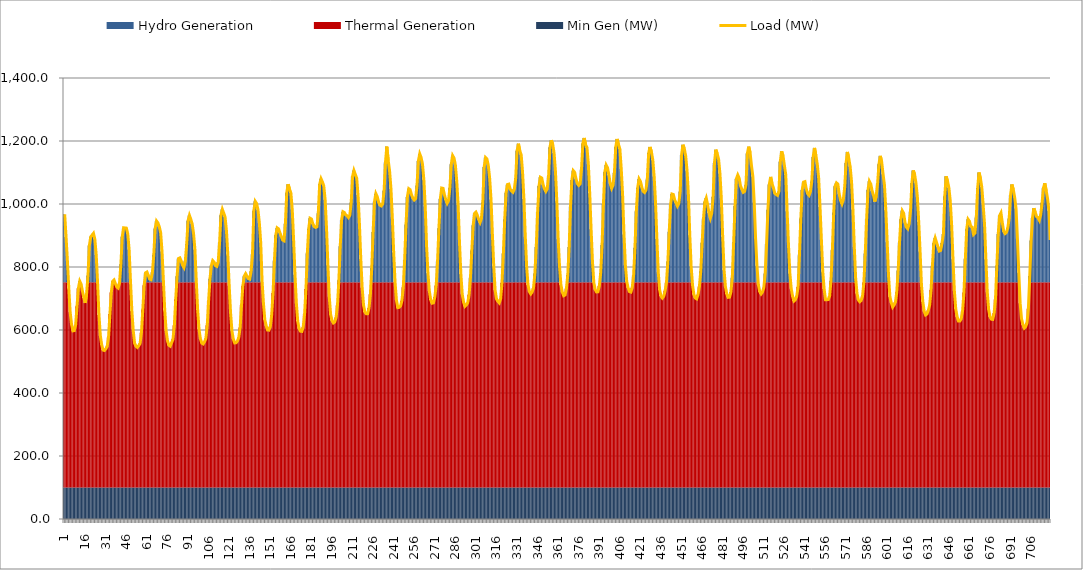
| Category | Min Gen (MW) | Thermal Generation | Hydro Generation |
|---|---|---|---|
| 1.0 | 100 | 651.288 | 216.149 |
| 2.0 | 100 | 651.288 | 143.571 |
| 3.0 | 100 | 651.288 | 66.719 |
| 4.0 | 100 | 632.033 | 0 |
| 5.0 | 100 | 556.286 | 0 |
| 6.0 | 100 | 518.188 | 0 |
| 7.0 | 100 | 497.248 | 0 |
| 8.0 | 100 | 498.122 | 0 |
| 9.0 | 100 | 516.383 | 0 |
| 10.0 | 100 | 575.154 | 0 |
| 11.0 | 100 | 632.534 | 0 |
| 12.0 | 100 | 651.288 | 3.547 |
| 13.0 | 100 | 645.373 | 0 |
| 14.0 | 100 | 621.87 | 0 |
| 15.0 | 100 | 601.825 | 0 |
| 16.0 | 100 | 585.856 | 0 |
| 17.0 | 100 | 615.7 | 0 |
| 18.0 | 100 | 651.288 | 21.34 |
| 19.0 | 100 | 651.288 | 116.661 |
| 20.0 | 100 | 651.288 | 144.428 |
| 21.0 | 100 | 651.288 | 149.88 |
| 22.0 | 100 | 651.288 | 155.557 |
| 23.0 | 100 | 651.288 | 136.68 |
| 24.0 | 100 | 651.288 | 86.635 |
| 25.0 | 100 | 649.834 | 0 |
| 26.0 | 100 | 547.674 | 0 |
| 27.0 | 100 | 482.234 | 0 |
| 28.0 | 100 | 452.803 | 0 |
| 29.0 | 100 | 436.325 | 0 |
| 30.0 | 100 | 435.028 | 0 |
| 31.0 | 100 | 439.875 | 0 |
| 32.0 | 100 | 447.696 | 0 |
| 33.0 | 100 | 477.305 | 0 |
| 34.0 | 100 | 550.943 | 0 |
| 35.0 | 100 | 618.675 | 0 |
| 36.0 | 100 | 651.288 | 3.34 |
| 37.0 | 100 | 651.288 | 7.448 |
| 38.0 | 100 | 646.757 | 0 |
| 39.0 | 100 | 636.496 | 0 |
| 40.0 | 100 | 633.091 | 0 |
| 41.0 | 100 | 648.858 | 0 |
| 42.0 | 100 | 651.288 | 57.212 |
| 43.0 | 100 | 651.288 | 145.111 |
| 44.0 | 100 | 651.288 | 173.255 |
| 45.0 | 100 | 651.288 | 172.578 |
| 46.0 | 100 | 651.288 | 172.202 |
| 47.0 | 100 | 651.288 | 153.997 |
| 48.0 | 100 | 651.288 | 104.059 |
| 49.0 | 100 | 651.288 | 4.13 |
| 50.0 | 100 | 560.334 | 0 |
| 51.0 | 100 | 498.241 | 0 |
| 52.0 | 100 | 457.922 | 0 |
| 53.0 | 100 | 448.782 | 0 |
| 54.0 | 100 | 444.621 | 0 |
| 55.0 | 100 | 450.14 | 0 |
| 56.0 | 100 | 457.413 | 0 |
| 57.0 | 100 | 491.998 | 0 |
| 58.0 | 100 | 565.444 | 0 |
| 59.0 | 100 | 642.311 | 0 |
| 60.0 | 100 | 651.288 | 30.083 |
| 61.0 | 100 | 651.288 | 32.78 |
| 62.0 | 100 | 651.288 | 22.235 |
| 63.0 | 100 | 651.288 | 10.411 |
| 64.0 | 100 | 651.288 | 8.234 |
| 65.0 | 100 | 651.288 | 32.075 |
| 66.0 | 100 | 651.288 | 87.612 |
| 67.0 | 100 | 651.288 | 170.656 |
| 68.0 | 100 | 651.288 | 194.668 |
| 69.0 | 100 | 651.288 | 188.659 |
| 70.0 | 100 | 651.288 | 176.569 |
| 71.0 | 100 | 651.288 | 157.797 |
| 72.0 | 100 | 651.288 | 98.161 |
| 73.0 | 100 | 651.288 | 5.673 |
| 74.0 | 100 | 562.038 | 0 |
| 75.0 | 100 | 496.705 | 0 |
| 76.0 | 100 | 465.662 | 0 |
| 77.0 | 100 | 451.708 | 0 |
| 78.0 | 100 | 448.698 | 0 |
| 79.0 | 100 | 459.694 | 0 |
| 80.0 | 100 | 470.505 | 0 |
| 81.0 | 100 | 514.441 | 0 |
| 82.0 | 100 | 597.545 | 0 |
| 83.0 | 100 | 651.288 | 19.617 |
| 84.0 | 100 | 651.288 | 75.374 |
| 85.0 | 100 | 651.288 | 77.615 |
| 86.0 | 100 | 651.288 | 67.983 |
| 87.0 | 100 | 651.288 | 54.461 |
| 88.0 | 100 | 651.288 | 47.081 |
| 89.0 | 100 | 651.288 | 67.995 |
| 90.0 | 100 | 651.288 | 120.781 |
| 91.0 | 100 | 651.288 | 195.656 |
| 92.0 | 100 | 651.288 | 212.52 |
| 93.0 | 100 | 651.288 | 200.225 |
| 94.0 | 100 | 651.288 | 185.296 |
| 95.0 | 100 | 651.288 | 154.869 |
| 96.0 | 100 | 651.288 | 104.261 |
| 97.0 | 100 | 651.288 | 3.17 |
| 98.0 | 100 | 563.456 | 0 |
| 99.0 | 100 | 502.173 | 0 |
| 100.0 | 100 | 471.88 | 0 |
| 101.0 | 100 | 458.504 | 0 |
| 102.0 | 100 | 455.849 | 0 |
| 103.0 | 100 | 462.394 | 0 |
| 104.0 | 100 | 473.02 | 0 |
| 105.0 | 100 | 514.906 | 0 |
| 106.0 | 100 | 593.203 | 0 |
| 107.0 | 100 | 651.288 | 11.653 |
| 108.0 | 100 | 651.288 | 53.264 |
| 109.0 | 100 | 651.288 | 68.945 |
| 110.0 | 100 | 651.288 | 64 |
| 111.0 | 100 | 651.288 | 52.959 |
| 112.0 | 100 | 651.288 | 50.694 |
| 113.0 | 100 | 651.288 | 64.802 |
| 114.0 | 100 | 651.288 | 126.207 |
| 115.0 | 100 | 651.288 | 213.09 |
| 116.0 | 100 | 651.288 | 231.721 |
| 117.0 | 100 | 651.288 | 219.838 |
| 118.0 | 100 | 651.288 | 207.291 |
| 119.0 | 100 | 651.288 | 164.085 |
| 120.0 | 100 | 651.288 | 88.027 |
| 121.0 | 100 | 640.786 | 0 |
| 122.0 | 100 | 554.681 | 0 |
| 123.0 | 100 | 497.255 | 0 |
| 124.0 | 100 | 471.229 | 0 |
| 125.0 | 100 | 458.87 | 0 |
| 126.0 | 100 | 459.447 | 0 |
| 127.0 | 100 | 464.704 | 0 |
| 128.0 | 100 | 476.3 | 0 |
| 129.0 | 100 | 508.152 | 0 |
| 130.0 | 100 | 579.16 | 0 |
| 131.0 | 100 | 640.398 | 0 |
| 132.0 | 100 | 651.288 | 19.594 |
| 133.0 | 100 | 651.288 | 27.554 |
| 134.0 | 100 | 651.288 | 19.63 |
| 135.0 | 100 | 651.288 | 11.944 |
| 136.0 | 100 | 651.288 | 10.361 |
| 137.0 | 100 | 651.288 | 35.449 |
| 138.0 | 100 | 651.288 | 90.032 |
| 139.0 | 100 | 651.288 | 227.379 |
| 140.0 | 100 | 651.288 | 257.149 |
| 141.0 | 100 | 651.288 | 250.357 |
| 142.0 | 100 | 651.288 | 230.194 |
| 143.0 | 100 | 651.288 | 188.408 |
| 144.0 | 100 | 651.288 | 126.349 |
| 145.0 | 100 | 651.288 | 2.885 |
| 146.0 | 100 | 584.209 | 0 |
| 147.0 | 100 | 532.189 | 0 |
| 148.0 | 100 | 513.198 | 0 |
| 149.0 | 100 | 499.936 | 0 |
| 150.0 | 100 | 499.598 | 0 |
| 151.0 | 100 | 510.473 | 0 |
| 152.0 | 100 | 547.758 | 0 |
| 153.0 | 100 | 617.421 | 0 |
| 154.0 | 100 | 651.288 | 69.211 |
| 155.0 | 100 | 651.288 | 149.945 |
| 156.0 | 100 | 651.288 | 172.909 |
| 157.0 | 100 | 651.288 | 169.819 |
| 158.0 | 100 | 651.288 | 157.233 |
| 159.0 | 100 | 651.288 | 145.859 |
| 160.0 | 100 | 651.288 | 134.413 |
| 161.0 | 100 | 651.288 | 131.932 |
| 162.0 | 100 | 651.288 | 186.28 |
| 163.0 | 100 | 651.288 | 284.761 |
| 164.0 | 100 | 651.288 | 311.615 |
| 165.0 | 100 | 651.288 | 296.129 |
| 166.0 | 100 | 651.288 | 283.694 |
| 167.0 | 100 | 651.288 | 230.874 |
| 168.0 | 100 | 651.288 | 133.759 |
| 169.0 | 100 | 651.288 | 24.033 |
| 170.0 | 100 | 584.532 | 0 |
| 171.0 | 100 | 527.97 | 0 |
| 172.0 | 100 | 504.423 | 0 |
| 173.0 | 100 | 496.158 | 0 |
| 174.0 | 100 | 495.66 | 0 |
| 175.0 | 100 | 509.12 | 0 |
| 176.0 | 100 | 550.42 | 0 |
| 177.0 | 100 | 629.994 | 0 |
| 178.0 | 100 | 651.288 | 91.805 |
| 179.0 | 100 | 651.288 | 169.991 |
| 180.0 | 100 | 651.288 | 203.492 |
| 181.0 | 100 | 651.288 | 201.152 |
| 182.0 | 100 | 651.288 | 186.006 |
| 183.0 | 100 | 651.288 | 177.146 |
| 184.0 | 100 | 651.288 | 174.331 |
| 185.0 | 100 | 651.288 | 176.251 |
| 186.0 | 100 | 651.288 | 219.377 |
| 187.0 | 100 | 651.288 | 311.381 |
| 188.0 | 100 | 651.288 | 328.763 |
| 189.0 | 100 | 651.288 | 318.867 |
| 190.0 | 100 | 651.288 | 305.968 |
| 191.0 | 100 | 651.288 | 261.841 |
| 192.0 | 100 | 651.288 | 170.971 |
| 193.0 | 100 | 651.288 | 54.389 |
| 194.0 | 100 | 605.369 | 0 |
| 195.0 | 100 | 549.406 | 0 |
| 196.0 | 100 | 529.984 | 0 |
| 197.0 | 100 | 522.382 | 0 |
| 198.0 | 100 | 525.548 | 0 |
| 199.0 | 100 | 539.78 | 0 |
| 200.0 | 100 | 578.813 | 0 |
| 201.0 | 100 | 651.288 | 6.333 |
| 202.0 | 100 | 651.288 | 114.855 |
| 203.0 | 100 | 651.288 | 197.415 |
| 204.0 | 100 | 651.288 | 224.194 |
| 205.0 | 100 | 651.288 | 221.924 |
| 206.0 | 100 | 651.288 | 213.967 |
| 207.0 | 100 | 651.288 | 211.472 |
| 208.0 | 100 | 651.288 | 205.738 |
| 209.0 | 100 | 651.288 | 212.998 |
| 210.0 | 100 | 651.288 | 253.247 |
| 211.0 | 100 | 651.288 | 336.246 |
| 212.0 | 100 | 651.288 | 355.038 |
| 213.0 | 100 | 651.288 | 342.685 |
| 214.0 | 100 | 651.288 | 330.845 |
| 215.0 | 100 | 651.288 | 277.054 |
| 216.0 | 100 | 651.288 | 185.917 |
| 217.0 | 100 | 651.288 | 73.949 |
| 218.0 | 100 | 633.886 | 0 |
| 219.0 | 100 | 579.365 | 0 |
| 220.0 | 100 | 556.797 | 0 |
| 221.0 | 100 | 551.558 | 0 |
| 222.0 | 100 | 551.861 | 0 |
| 223.0 | 100 | 569.768 | 0 |
| 224.0 | 100 | 613.15 | 0 |
| 225.0 | 100 | 651.288 | 45.579 |
| 226.0 | 100 | 651.288 | 159.708 |
| 227.0 | 100 | 651.288 | 256.019 |
| 228.0 | 100 | 651.288 | 281.534 |
| 229.0 | 100 | 651.288 | 272.109 |
| 230.0 | 100 | 651.288 | 254.31 |
| 231.0 | 100 | 651.288 | 244.783 |
| 232.0 | 100 | 651.288 | 242.547 |
| 233.0 | 100 | 651.288 | 248.96 |
| 234.0 | 100 | 651.288 | 291.141 |
| 235.0 | 100 | 651.288 | 380.68 |
| 236.0 | 100 | 651.288 | 430.872 |
| 237.0 | 100 | 651.288 | 387.023 |
| 238.0 | 100 | 651.288 | 353.816 |
| 239.0 | 100 | 651.288 | 297.286 |
| 240.0 | 100 | 651.288 | 207.002 |
| 241.0 | 100 | 651.288 | 94.801 |
| 242.0 | 100 | 651.288 | 0.113 |
| 243.0 | 100 | 594.392 | 0 |
| 244.0 | 100 | 571.218 | 0 |
| 245.0 | 100 | 572.102 | 0 |
| 246.0 | 100 | 576.132 | 0 |
| 247.0 | 100 | 592.738 | 0 |
| 248.0 | 100 | 635.601 | 0 |
| 249.0 | 100 | 651.288 | 71.487 |
| 250.0 | 100 | 651.288 | 183.523 |
| 251.0 | 100 | 651.288 | 271.316 |
| 252.0 | 100 | 651.288 | 297.341 |
| 253.0 | 100 | 651.288 | 294.192 |
| 254.0 | 100 | 651.288 | 277.759 |
| 255.0 | 100 | 651.288 | 267.015 |
| 256.0 | 100 | 651.288 | 261.146 |
| 257.0 | 100 | 651.288 | 265.434 |
| 258.0 | 100 | 651.288 | 307.293 |
| 259.0 | 100 | 651.288 | 385.082 |
| 260.0 | 100 | 651.288 | 407.818 |
| 261.0 | 100 | 651.288 | 396.374 |
| 262.0 | 100 | 651.288 | 375.215 |
| 263.0 | 100 | 651.288 | 325.969 |
| 264.0 | 100 | 651.288 | 241.074 |
| 265.0 | 100 | 651.288 | 114.445 |
| 266.0 | 100 | 651.288 | 28.695 |
| 267.0 | 100 | 623.89 | 0 |
| 268.0 | 100 | 595.625 | 0 |
| 269.0 | 100 | 585.069 | 0 |
| 270.0 | 100 | 586.292 | 0 |
| 271.0 | 100 | 604.552 | 0 |
| 272.0 | 100 | 641.616 | 0 |
| 273.0 | 100 | 651.288 | 66.179 |
| 274.0 | 100 | 651.288 | 171.976 |
| 275.0 | 100 | 651.288 | 264.744 |
| 276.0 | 100 | 651.288 | 299.393 |
| 277.0 | 100 | 651.288 | 298.418 |
| 278.0 | 100 | 651.288 | 278.225 |
| 279.0 | 100 | 651.288 | 262.326 |
| 280.0 | 100 | 651.288 | 250.974 |
| 281.0 | 100 | 651.288 | 259.56 |
| 282.0 | 100 | 651.288 | 299.976 |
| 283.0 | 100 | 651.288 | 374.656 |
| 284.0 | 100 | 651.288 | 402.329 |
| 285.0 | 100 | 651.288 | 394.643 |
| 286.0 | 100 | 651.288 | 372.406 |
| 287.0 | 100 | 651.288 | 321.008 |
| 288.0 | 100 | 651.288 | 245.783 |
| 289.0 | 100 | 651.288 | 126.297 |
| 290.0 | 100 | 651.288 | 26.183 |
| 291.0 | 100 | 613.378 | 0 |
| 292.0 | 100 | 588.454 | 0 |
| 293.0 | 100 | 575.028 | 0 |
| 294.0 | 100 | 579.238 | 0 |
| 295.0 | 100 | 586.308 | 0 |
| 296.0 | 100 | 611.508 | 0 |
| 297.0 | 100 | 651.288 | 14.861 |
| 298.0 | 100 | 651.288 | 101.349 |
| 299.0 | 100 | 651.288 | 181.554 |
| 300.0 | 100 | 651.288 | 218.575 |
| 301.0 | 100 | 651.288 | 222.786 |
| 302.0 | 100 | 651.288 | 213.261 |
| 303.0 | 100 | 651.288 | 199.576 |
| 304.0 | 100 | 651.288 | 189.881 |
| 305.0 | 100 | 651.288 | 202.237 |
| 306.0 | 100 | 651.288 | 253.627 |
| 307.0 | 100 | 651.288 | 365.987 |
| 308.0 | 100 | 651.288 | 396.269 |
| 309.0 | 100 | 651.288 | 391.814 |
| 310.0 | 100 | 651.288 | 371.484 |
| 311.0 | 100 | 651.288 | 330.88 |
| 312.0 | 100 | 651.288 | 263.172 |
| 313.0 | 100 | 651.288 | 152.86 |
| 314.0 | 100 | 651.288 | 50.372 |
| 315.0 | 100 | 626.018 | 0 |
| 316.0 | 100 | 598.488 | 0 |
| 317.0 | 100 | 590.959 | 0 |
| 318.0 | 100 | 586.095 | 0 |
| 319.0 | 100 | 599.001 | 0 |
| 320.0 | 100 | 649.743 | 0 |
| 321.0 | 100 | 651.288 | 91.232 |
| 322.0 | 100 | 651.288 | 200.469 |
| 323.0 | 100 | 651.288 | 284.462 |
| 324.0 | 100 | 651.288 | 310.474 |
| 325.0 | 100 | 651.288 | 311.775 |
| 326.0 | 100 | 651.288 | 295.765 |
| 327.0 | 100 | 651.288 | 289.967 |
| 328.0 | 100 | 651.288 | 286.151 |
| 329.0 | 100 | 651.288 | 296.083 |
| 330.0 | 100 | 651.288 | 330.101 |
| 331.0 | 100 | 651.288 | 417.686 |
| 332.0 | 100 | 651.288 | 440.094 |
| 333.0 | 100 | 651.288 | 417.486 |
| 334.0 | 100 | 651.288 | 404.847 |
| 335.0 | 100 | 651.288 | 349.842 |
| 336.0 | 100 | 651.288 | 264.256 |
| 337.0 | 100 | 651.288 | 144.572 |
| 338.0 | 100 | 651.288 | 48.734 |
| 339.0 | 100 | 642.907 | 0 |
| 340.0 | 100 | 621.715 | 0 |
| 341.0 | 100 | 614.496 | 0 |
| 342.0 | 100 | 620.605 | 0 |
| 343.0 | 100 | 633.554 | 0 |
| 344.0 | 100 | 651.288 | 28.24 |
| 345.0 | 100 | 651.288 | 112.572 |
| 346.0 | 100 | 651.288 | 223.686 |
| 347.0 | 100 | 651.288 | 305.707 |
| 348.0 | 100 | 651.288 | 333.715 |
| 349.0 | 100 | 651.288 | 331.172 |
| 350.0 | 100 | 651.288 | 309.875 |
| 351.0 | 100 | 651.288 | 296.852 |
| 352.0 | 100 | 651.288 | 288.749 |
| 353.0 | 100 | 651.288 | 296.722 |
| 354.0 | 100 | 651.288 | 337.976 |
| 355.0 | 100 | 651.288 | 428.703 |
| 356.0 | 100 | 651.288 | 451.181 |
| 357.0 | 100 | 651.288 | 438.236 |
| 358.0 | 100 | 651.288 | 410.51 |
| 359.0 | 100 | 651.288 | 351.845 |
| 360.0 | 100 | 651.288 | 257.386 |
| 361.0 | 100 | 651.288 | 136.499 |
| 362.0 | 100 | 651.288 | 49.342 |
| 363.0 | 100 | 643.378 | 0 |
| 364.0 | 100 | 620.061 | 0 |
| 365.0 | 100 | 608.749 | 0 |
| 366.0 | 100 | 611.179 | 0 |
| 367.0 | 100 | 631.389 | 0 |
| 368.0 | 100 | 651.288 | 23.571 |
| 369.0 | 100 | 651.288 | 111.86 |
| 370.0 | 100 | 651.288 | 240.466 |
| 371.0 | 100 | 651.288 | 325.123 |
| 372.0 | 100 | 651.288 | 354.508 |
| 373.0 | 100 | 651.288 | 349.368 |
| 374.0 | 100 | 651.288 | 328.737 |
| 375.0 | 100 | 651.288 | 313.475 |
| 376.0 | 100 | 651.288 | 307.827 |
| 377.0 | 100 | 651.288 | 312.845 |
| 378.0 | 100 | 651.288 | 358.194 |
| 379.0 | 100 | 651.288 | 440.666 |
| 380.0 | 100 | 651.288 | 458.356 |
| 381.0 | 100 | 651.288 | 436.371 |
| 382.0 | 100 | 651.288 | 427.547 |
| 383.0 | 100 | 651.288 | 375.728 |
| 384.0 | 100 | 651.288 | 282.68 |
| 385.0 | 100 | 651.288 | 168.998 |
| 386.0 | 100 | 651.288 | 65.865 |
| 387.0 | 100 | 650.446 | 0 |
| 388.0 | 100 | 628.499 | 0 |
| 389.0 | 100 | 620.786 | 0 |
| 390.0 | 100 | 621.299 | 0 |
| 391.0 | 100 | 639.643 | 0 |
| 392.0 | 100 | 651.288 | 29.627 |
| 393.0 | 100 | 651.288 | 118.374 |
| 394.0 | 100 | 651.288 | 248.579 |
| 395.0 | 100 | 651.288 | 350.116 |
| 396.0 | 100 | 651.288 | 372.276 |
| 397.0 | 100 | 651.288 | 363.685 |
| 398.0 | 100 | 651.288 | 339.777 |
| 399.0 | 100 | 651.288 | 312.981 |
| 400.0 | 100 | 651.288 | 298.384 |
| 401.0 | 100 | 651.288 | 307.95 |
| 402.0 | 100 | 651.288 | 347.708 |
| 403.0 | 100 | 651.288 | 429.871 |
| 404.0 | 100 | 651.288 | 455.147 |
| 405.0 | 100 | 651.288 | 437.205 |
| 406.0 | 100 | 651.288 | 423.516 |
| 407.0 | 100 | 651.288 | 359.982 |
| 408.0 | 100 | 651.288 | 276.491 |
| 409.0 | 100 | 651.288 | 151.646 |
| 410.0 | 100 | 651.288 | 55.31 |
| 411.0 | 100 | 651.288 | 2.881 |
| 412.0 | 100 | 633.892 | 0 |
| 413.0 | 100 | 621.808 | 0 |
| 414.0 | 100 | 620.406 | 0 |
| 415.0 | 100 | 634.08 | 0 |
| 416.0 | 100 | 651.288 | 21.348 |
| 417.0 | 100 | 651.288 | 109.939 |
| 418.0 | 100 | 651.288 | 225.384 |
| 419.0 | 100 | 651.288 | 300.487 |
| 420.0 | 100 | 651.288 | 328.327 |
| 421.0 | 100 | 651.288 | 320.597 |
| 422.0 | 100 | 651.288 | 302.127 |
| 423.0 | 100 | 651.288 | 288.928 |
| 424.0 | 100 | 651.288 | 285.367 |
| 425.0 | 100 | 651.288 | 292.722 |
| 426.0 | 100 | 651.288 | 326.662 |
| 427.0 | 100 | 651.288 | 410.44 |
| 428.0 | 100 | 651.288 | 429.904 |
| 429.0 | 100 | 651.288 | 413.846 |
| 430.0 | 100 | 651.288 | 389.069 |
| 431.0 | 100 | 651.288 | 336.08 |
| 432.0 | 100 | 651.288 | 252.399 |
| 433.0 | 100 | 651.288 | 137.511 |
| 434.0 | 100 | 651.288 | 31.794 |
| 435.0 | 100 | 627.757 | 0 |
| 436.0 | 100 | 607.551 | 0 |
| 437.0 | 100 | 601.455 | 0 |
| 438.0 | 100 | 607.135 | 0 |
| 439.0 | 100 | 624.433 | 0 |
| 440.0 | 100 | 650.647 | 0 |
| 441.0 | 100 | 651.288 | 65.904 |
| 442.0 | 100 | 651.288 | 160.972 |
| 443.0 | 100 | 651.288 | 247.306 |
| 444.0 | 100 | 651.288 | 280.307 |
| 445.0 | 100 | 651.288 | 278.806 |
| 446.0 | 100 | 651.288 | 261.702 |
| 447.0 | 100 | 651.288 | 252.049 |
| 448.0 | 100 | 651.288 | 241.883 |
| 449.0 | 100 | 651.288 | 250.021 |
| 450.0 | 100 | 651.288 | 288.228 |
| 451.0 | 100 | 651.288 | 404.005 |
| 452.0 | 100 | 651.288 | 436.81 |
| 453.0 | 100 | 651.288 | 424.405 |
| 454.0 | 100 | 651.288 | 401.255 |
| 455.0 | 100 | 651.288 | 354.394 |
| 456.0 | 100 | 651.288 | 277.803 |
| 457.0 | 100 | 651.288 | 149.486 |
| 458.0 | 100 | 651.288 | 49.949 |
| 459.0 | 100 | 642.433 | 0 |
| 460.0 | 100 | 612.599 | 0 |
| 461.0 | 100 | 601.619 | 0 |
| 462.0 | 100 | 598.903 | 0 |
| 463.0 | 100 | 612.265 | 0 |
| 464.0 | 100 | 637.871 | 0 |
| 465.0 | 100 | 651.288 | 35.024 |
| 466.0 | 100 | 651.288 | 125.766 |
| 467.0 | 100 | 651.288 | 202.229 |
| 468.0 | 100 | 651.288 | 255.577 |
| 469.0 | 100 | 651.288 | 267.621 |
| 470.0 | 100 | 651.288 | 246.776 |
| 471.0 | 100 | 651.288 | 220.242 |
| 472.0 | 100 | 651.288 | 203.817 |
| 473.0 | 100 | 651.288 | 219.155 |
| 474.0 | 100 | 651.288 | 271.04 |
| 475.0 | 100 | 651.288 | 379.157 |
| 476.0 | 100 | 651.288 | 421.145 |
| 477.0 | 100 | 651.288 | 408.046 |
| 478.0 | 100 | 651.288 | 391.281 |
| 479.0 | 100 | 651.288 | 345.4 |
| 480.0 | 100 | 651.288 | 266.589 |
| 481.0 | 100 | 651.288 | 145.068 |
| 482.0 | 100 | 651.288 | 38.933 |
| 483.0 | 100 | 637.044 | 0 |
| 484.0 | 100 | 614.348 | 0 |
| 485.0 | 100 | 603.725 | 0 |
| 486.0 | 100 | 604.325 | 0 |
| 487.0 | 100 | 620.744 | 0 |
| 488.0 | 100 | 651.288 | 14.81 |
| 489.0 | 100 | 651.288 | 126.986 |
| 490.0 | 100 | 651.288 | 242.226 |
| 491.0 | 100 | 651.288 | 328.939 |
| 492.0 | 100 | 651.288 | 340.812 |
| 493.0 | 100 | 651.288 | 330.981 |
| 494.0 | 100 | 651.288 | 305.855 |
| 495.0 | 100 | 651.288 | 295.522 |
| 496.0 | 100 | 651.288 | 285.815 |
| 497.0 | 100 | 651.288 | 288.735 |
| 498.0 | 100 | 651.288 | 310.213 |
| 499.0 | 100 | 651.288 | 408.911 |
| 500.0 | 100 | 651.288 | 430.671 |
| 501.0 | 100 | 651.288 | 411.336 |
| 502.0 | 100 | 651.288 | 370.821 |
| 503.0 | 100 | 651.288 | 336.106 |
| 504.0 | 100 | 651.288 | 253.362 |
| 505.0 | 100 | 651.288 | 139.49 |
| 506.0 | 100 | 651.288 | 52.636 |
| 507.0 | 100 | 644.088 | 0 |
| 508.0 | 100 | 621.942 | 0 |
| 509.0 | 100 | 614.365 | 0 |
| 510.0 | 100 | 620.476 | 0 |
| 511.0 | 100 | 634.419 | 0 |
| 512.0 | 100 | 651.288 | 27.984 |
| 513.0 | 100 | 651.288 | 121.283 |
| 514.0 | 100 | 651.288 | 230.212 |
| 515.0 | 100 | 651.288 | 310.813 |
| 516.0 | 100 | 651.288 | 334.729 |
| 517.0 | 100 | 651.288 | 313.457 |
| 518.0 | 100 | 651.288 | 299.854 |
| 519.0 | 100 | 651.288 | 282.47 |
| 520.0 | 100 | 651.288 | 279.031 |
| 521.0 | 100 | 651.288 | 276.049 |
| 522.0 | 100 | 651.288 | 288.241 |
| 523.0 | 100 | 651.288 | 382.519 |
| 524.0 | 100 | 651.288 | 415.975 |
| 525.0 | 100 | 651.288 | 402.143 |
| 526.0 | 100 | 651.288 | 371.255 |
| 527.0 | 100 | 651.288 | 341.634 |
| 528.0 | 100 | 651.288 | 226.03 |
| 529.0 | 100 | 651.288 | 118.175 |
| 530.0 | 100 | 651.288 | 28.467 |
| 531.0 | 100 | 631.295 | 0 |
| 532.0 | 100 | 606.479 | 0 |
| 533.0 | 100 | 592.117 | 0 |
| 534.0 | 100 | 596.085 | 0 |
| 535.0 | 100 | 607.096 | 0 |
| 536.0 | 100 | 636.817 | 0 |
| 537.0 | 100 | 651.288 | 87.936 |
| 538.0 | 100 | 651.288 | 203.045 |
| 539.0 | 100 | 651.288 | 293.194 |
| 540.0 | 100 | 651.288 | 318.23 |
| 541.0 | 100 | 651.288 | 319.624 |
| 542.0 | 100 | 651.288 | 296.138 |
| 543.0 | 100 | 651.288 | 281.498 |
| 544.0 | 100 | 651.288 | 276.261 |
| 545.0 | 100 | 651.288 | 287.79 |
| 546.0 | 100 | 651.288 | 320.492 |
| 547.0 | 100 | 651.288 | 397.523 |
| 548.0 | 100 | 651.288 | 426.705 |
| 549.0 | 100 | 651.288 | 402.639 |
| 550.0 | 100 | 651.288 | 374.592 |
| 551.0 | 100 | 651.288 | 331.555 |
| 552.0 | 100 | 651.288 | 239.363 |
| 553.0 | 100 | 651.288 | 135.148 |
| 554.0 | 100 | 651.288 | 33.992 |
| 555.0 | 100 | 630.38 | 0 |
| 556.0 | 100 | 596.36 | 0 |
| 557.0 | 100 | 596.343 | 0 |
| 558.0 | 100 | 596.54 | 0 |
| 559.0 | 100 | 607.8 | 0 |
| 560.0 | 100 | 651.288 | 5.355 |
| 561.0 | 100 | 651.288 | 102.047 |
| 562.0 | 100 | 651.288 | 221.794 |
| 563.0 | 100 | 651.288 | 305.175 |
| 564.0 | 100 | 651.288 | 315.775 |
| 565.0 | 100 | 651.288 | 312.065 |
| 566.0 | 100 | 651.288 | 280.507 |
| 567.0 | 100 | 651.288 | 259.566 |
| 568.0 | 100 | 651.288 | 249.101 |
| 569.0 | 100 | 651.288 | 262.756 |
| 570.0 | 100 | 651.288 | 301.285 |
| 571.0 | 100 | 651.288 | 378.569 |
| 572.0 | 100 | 651.288 | 413.994 |
| 573.0 | 100 | 651.288 | 392.536 |
| 574.0 | 100 | 651.288 | 366.915 |
| 575.0 | 100 | 651.288 | 319.024 |
| 576.0 | 100 | 651.288 | 231.416 |
| 577.0 | 100 | 651.288 | 112.256 |
| 578.0 | 100 | 651.288 | 12.629 |
| 579.0 | 100 | 615.542 | 0 |
| 580.0 | 100 | 595.2 | 0 |
| 581.0 | 100 | 589.746 | 0 |
| 582.0 | 100 | 593.585 | 0 |
| 583.0 | 100 | 606.71 | 0 |
| 584.0 | 100 | 650.691 | 0 |
| 585.0 | 100 | 651.288 | 91.643 |
| 586.0 | 100 | 651.288 | 201.585 |
| 587.0 | 100 | 651.288 | 293.458 |
| 588.0 | 100 | 651.288 | 320.939 |
| 589.0 | 100 | 651.288 | 312.399 |
| 590.0 | 100 | 651.288 | 290.141 |
| 591.0 | 100 | 651.288 | 276.518 |
| 592.0 | 100 | 651.288 | 256.54 |
| 593.0 | 100 | 651.288 | 273.804 |
| 594.0 | 100 | 651.288 | 313.435 |
| 595.0 | 100 | 651.288 | 375.057 |
| 596.0 | 100 | 651.288 | 401.502 |
| 597.0 | 100 | 651.288 | 381.204 |
| 598.0 | 100 | 651.288 | 343.34 |
| 599.0 | 100 | 651.288 | 309.211 |
| 600.0 | 100 | 651.288 | 229.465 |
| 601.0 | 100 | 651.288 | 127.221 |
| 602.0 | 100 | 651.288 | 19.023 |
| 603.0 | 100 | 605.633 | 0 |
| 604.0 | 100 | 586.557 | 0 |
| 605.0 | 100 | 572.868 | 0 |
| 606.0 | 100 | 579.487 | 0 |
| 607.0 | 100 | 588.339 | 0 |
| 608.0 | 100 | 620.074 | 0 |
| 609.0 | 100 | 651.288 | 37.515 |
| 610.0 | 100 | 651.288 | 126.356 |
| 611.0 | 100 | 651.288 | 200.638 |
| 612.0 | 100 | 651.288 | 227.228 |
| 613.0 | 100 | 651.288 | 219.576 |
| 614.0 | 100 | 651.288 | 190.226 |
| 615.0 | 100 | 651.288 | 175.084 |
| 616.0 | 100 | 651.288 | 170.17 |
| 617.0 | 100 | 651.288 | 185.67 |
| 618.0 | 100 | 651.288 | 225.039 |
| 619.0 | 100 | 651.288 | 315.091 |
| 620.0 | 100 | 651.288 | 355.254 |
| 621.0 | 100 | 651.288 | 342.651 |
| 622.0 | 100 | 651.288 | 314.704 |
| 623.0 | 100 | 651.288 | 271.731 |
| 624.0 | 100 | 651.288 | 192.229 |
| 625.0 | 100 | 651.288 | 98.021 |
| 626.0 | 100 | 643.157 | 0 |
| 627.0 | 100 | 589.698 | 0 |
| 628.0 | 100 | 558.986 | 0 |
| 629.0 | 100 | 547.655 | 0 |
| 630.0 | 100 | 550.75 | 0 |
| 631.0 | 100 | 562.158 | 0 |
| 632.0 | 100 | 579.889 | 0 |
| 633.0 | 100 | 627.237 | 0 |
| 634.0 | 100 | 651.288 | 52.924 |
| 635.0 | 100 | 651.288 | 125.175 |
| 636.0 | 100 | 651.288 | 140.975 |
| 637.0 | 100 | 651.288 | 126.665 |
| 638.0 | 100 | 651.288 | 113.005 |
| 639.0 | 100 | 651.288 | 99.418 |
| 640.0 | 100 | 651.288 | 101.293 |
| 641.0 | 100 | 651.288 | 124.745 |
| 642.0 | 100 | 651.288 | 153.197 |
| 643.0 | 100 | 651.288 | 272.96 |
| 644.0 | 100 | 651.288 | 336.553 |
| 645.0 | 100 | 651.288 | 321.521 |
| 646.0 | 100 | 651.288 | 300.273 |
| 647.0 | 100 | 651.288 | 259.214 |
| 648.0 | 100 | 651.288 | 183.571 |
| 649.0 | 100 | 651.288 | 73.546 |
| 650.0 | 100 | 624.504 | 0 |
| 651.0 | 100 | 567.451 | 0 |
| 652.0 | 100 | 542.241 | 0 |
| 653.0 | 100 | 528.495 | 0 |
| 654.0 | 100 | 528.586 | 0 |
| 655.0 | 100 | 535.287 | 0 |
| 656.0 | 100 | 560.702 | 0 |
| 657.0 | 100 | 619.25 | 0 |
| 658.0 | 100 | 651.288 | 73.601 |
| 659.0 | 100 | 651.288 | 168.456 |
| 660.0 | 100 | 651.288 | 200.08 |
| 661.0 | 100 | 651.288 | 193.969 |
| 662.0 | 100 | 651.288 | 177.343 |
| 663.0 | 100 | 651.288 | 175.314 |
| 664.0 | 100 | 651.288 | 151.735 |
| 665.0 | 100 | 651.288 | 156.137 |
| 666.0 | 100 | 651.288 | 206.199 |
| 667.0 | 100 | 651.288 | 299.537 |
| 668.0 | 100 | 651.288 | 348.668 |
| 669.0 | 100 | 651.288 | 330.481 |
| 670.0 | 100 | 651.288 | 302.378 |
| 671.0 | 100 | 651.288 | 246.152 |
| 672.0 | 100 | 651.288 | 185.548 |
| 673.0 | 100 | 651.288 | 73.263 |
| 674.0 | 100 | 620.174 | 0 |
| 675.0 | 100 | 565.675 | 0 |
| 676.0 | 100 | 542.399 | 0 |
| 677.0 | 100 | 534.45 | 0 |
| 678.0 | 100 | 533.722 | 0 |
| 679.0 | 100 | 553.537 | 0 |
| 680.0 | 100 | 597.737 | 0 |
| 681.0 | 100 | 651.288 | 52.946 |
| 682.0 | 100 | 651.288 | 153.398 |
| 683.0 | 100 | 651.288 | 211.748 |
| 684.0 | 100 | 651.288 | 220.427 |
| 685.0 | 100 | 651.288 | 188.769 |
| 686.0 | 100 | 651.288 | 161.661 |
| 687.0 | 100 | 651.288 | 154.786 |
| 688.0 | 100 | 651.288 | 158.617 |
| 689.0 | 100 | 651.288 | 173.063 |
| 690.0 | 100 | 651.288 | 202.933 |
| 691.0 | 100 | 651.288 | 276.644 |
| 692.0 | 100 | 651.288 | 310.635 |
| 693.0 | 100 | 651.288 | 294.169 |
| 694.0 | 100 | 651.288 | 269.79 |
| 695.0 | 100 | 651.288 | 234.037 |
| 696.0 | 100 | 651.288 | 138.575 |
| 697.0 | 100 | 651.288 | 30.484 |
| 698.0 | 100 | 585.183 | 0 |
| 699.0 | 100 | 535.436 | 0 |
| 700.0 | 100 | 517.043 | 0 |
| 701.0 | 100 | 506.185 | 0 |
| 702.0 | 100 | 510.807 | 0 |
| 703.0 | 100 | 522.644 | 0 |
| 704.0 | 100 | 567.578 | 0 |
| 705.0 | 100 | 651.288 | 19.766 |
| 706.0 | 100 | 651.288 | 132.801 |
| 707.0 | 100 | 651.288 | 204.497 |
| 708.0 | 100 | 651.288 | 235.183 |
| 709.0 | 100 | 651.288 | 222.468 |
| 710.0 | 100 | 651.288 | 208.783 |
| 711.0 | 100 | 651.288 | 205.219 |
| 712.0 | 100 | 651.288 | 197.037 |
| 713.0 | 100 | 651.288 | 214.977 |
| 714.0 | 100 | 651.288 | 252.325 |
| 715.0 | 100 | 651.288 | 299.97 |
| 716.0 | 100 | 651.288 | 314.573 |
| 717.0 | 100 | 651.288 | 290.337 |
| 718.0 | 100 | 651.288 | 265.143 |
| 719.0 | 100 | 651.288 | 227.13 |
| 720.0 | 100 | 651.288 | 134.786 |